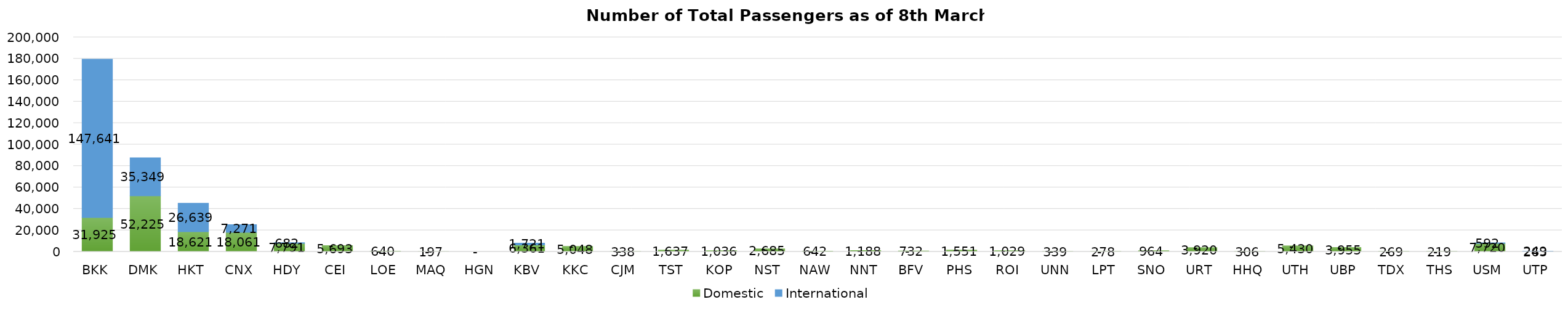
| Category | Domestic | International |
|---|---|---|
| BKK | 31925 | 147641 |
| DMK | 52225 | 35349 |
| HKT | 18621 | 26639 |
| CNX | 18061 | 7271 |
| HDY | 7791 | 682 |
| CEI | 5693 | 0 |
| LOE | 640 | 0 |
| MAQ | 197 | 0 |
| HGN | 0 | 0 |
| KBV | 6361 | 1721 |
| KKC | 5048 | 0 |
| CJM | 338 | 0 |
| TST | 1637 | 0 |
| KOP | 1036 | 0 |
| NST | 2685 | 0 |
| NAW | 642 | 0 |
| NNT | 1188 | 0 |
| BFV | 732 | 0 |
| PHS | 1551 | 0 |
| ROI | 1029 | 0 |
| UNN | 339 | 0 |
| LPT | 278 | 0 |
| SNO | 964 | 0 |
| URT | 3920 | 0 |
| HHQ | 306 | 0 |
| UTH | 5430 | 0 |
| UBP | 3955 | 0 |
| TDX | 269 | 0 |
| THS | 219 | 0 |
| USM | 7720 | 592 |
| UTP | 263 | 249 |